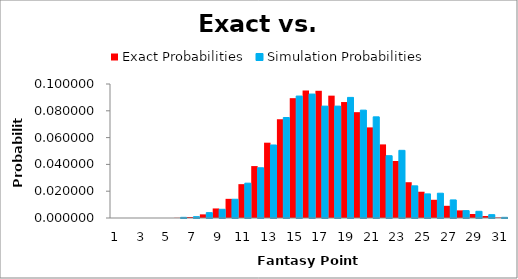
| Category | Exact Probabilities | Simulation Probabilities |
|---|---|---|
| 0 | 0 | 0 |
| 1 | 0 | 0 |
| 2 | 0 | 0 |
| 3 | 0 | 0 |
| 4 | 0 | 0 |
| 5 | 0 | 0 |
| 6 | 0.001 | 0.001 |
| 7 | 0.003 | 0.004 |
| 8 | 0.007 | 0.006 |
| 9 | 0.014 | 0.014 |
| 10 | 0.025 | 0.026 |
| 11 | 0.039 | 0.038 |
| 12 | 0.056 | 0.054 |
| 13 | 0.074 | 0.075 |
| 14 | 0.089 | 0.091 |
| 15 | 0.095 | 0.092 |
| 16 | 0.095 | 0.084 |
| 17 | 0.091 | 0.084 |
| 18 | 0.087 | 0.09 |
| 19 | 0.079 | 0.08 |
| 20 | 0.068 | 0.076 |
| 21 | 0.055 | 0.046 |
| 22 | 0.043 | 0.05 |
| 23 | 0.027 | 0.024 |
| 24 | 0.02 | 0.018 |
| 25 | 0.014 | 0.018 |
| 26 | 0.009 | 0.014 |
| 27 | 0.006 | 0.006 |
| 28 | 0.003 | 0.005 |
| 29 | 0.002 | 0.002 |
| 30 | 0 | 0 |